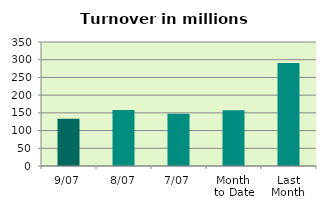
| Category | Series 0 |
|---|---|
| 9/07 | 133.412 |
| 8/07 | 157.93 |
| 7/07 | 147.236 |
| Month 
to Date | 157.558 |
| Last
Month | 290.981 |